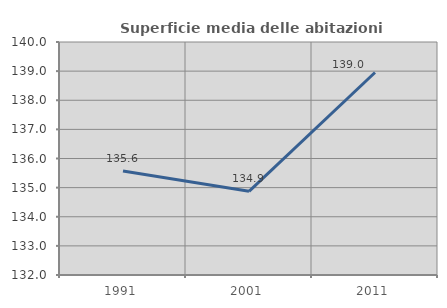
| Category | Superficie media delle abitazioni occupate |
|---|---|
| 1991.0 | 135.574 |
| 2001.0 | 134.873 |
| 2011.0 | 138.952 |